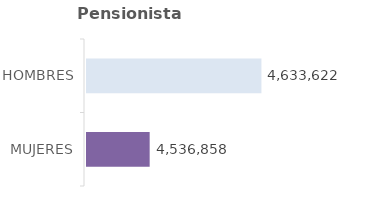
| Category | Series 0 | Series 1 |
|---|---|---|
| MUJERES | 4536858 |  |
| HOMBRES | 4633622 |  |